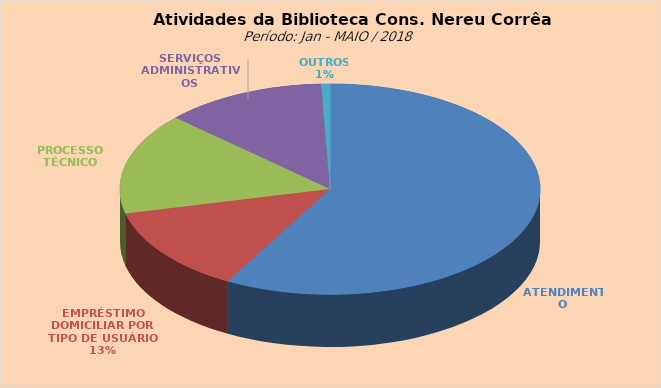
| Category | Series 0 |
|---|---|
| ATENDIMENTO | 5410 |
| EMPRÉSTIMO DOMICILIAR POR TIPO DE USUÁRIO | 1231 |
| PROCESSO TÉCNICO | 1452 |
| SERVIÇOS ADMINISTRATIVOS | 1159 |
| OUTROS | 63 |